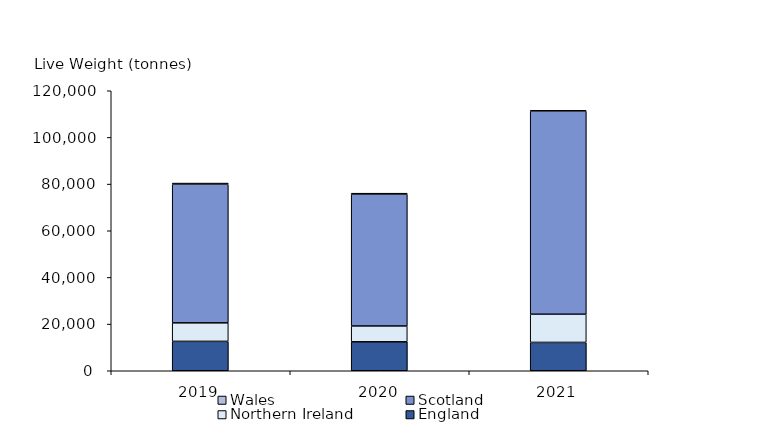
| Category | England | Northern Ireland | Scotland | Wales |
|---|---|---|---|---|
| 2019.0 | 12595.156 | 7946.337 | 59410.854 | 490.638 |
| 2020.0 | 12412.606 | 6783.751 | 56527.319 | 380.348 |
| 2021.0 | 12141.907 | 12088.628 | 87106.08 | 291.854 |